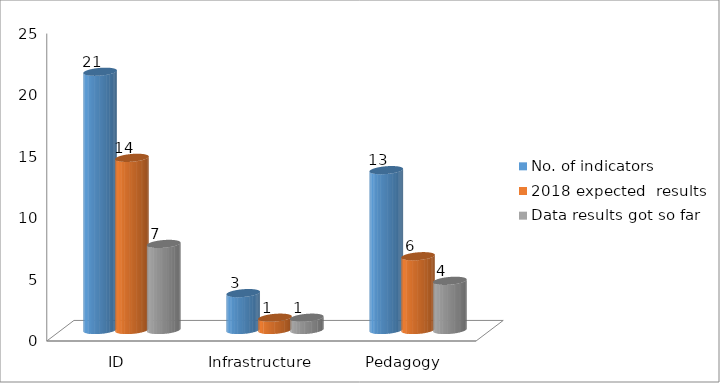
| Category | No. of indicators | 2018 expected  results | Data results got so far |
|---|---|---|---|
| ID | 21 | 14 | 7 |
| Infrastructure | 3 | 1 | 1 |
| Pedagogy | 13 | 6 | 4 |